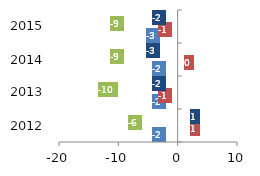
| Category | ACC Ltd Power & Fuel | Ambuja Cement Power & Fuel | JK Lakshmi Cement Power & Fuel | Ultratech Cement Power & Fuel |
|---|---|---|---|---|
| 2012.0 | -2 | 1 | -6 | 1 |
| 2013.0 | -2 | -1 | -10 | -2 |
| 2014.0 | -2 | 0 | -9 | -3 |
| 2015.0 | -3 | -1 | -9 | -2 |